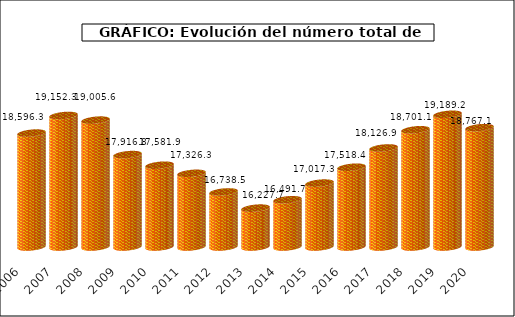
| Category | Series1 |
|---|---|
| 2006.0 | 18596.3 |
| 2007.0 | 19152.3 |
| 2008.0 | 19005.6 |
| 2009.0 | 17916.8 |
| 2010.0 | 17581.9 |
| 2011.0 | 17326.3 |
| 2012.0 | 16738.5 |
| 2013.0 | 16227.7 |
| 2014.0 | 16491.7 |
| 2015.0 | 17017.3 |
| 2016.0 | 17518.4 |
| 2017.0 | 18126.9 |
| 2018.0 | 18701.1 |
| 2019.0 | 19189.213 |
| 2020.0 | 18767.144 |